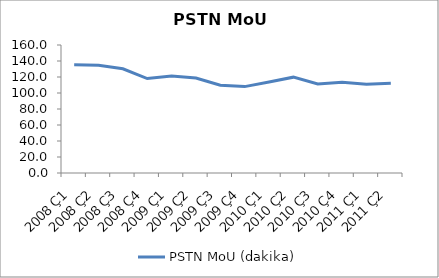
| Category | PSTN MoU (dakika) |
|---|---|
| 2008 Ç1 | 135.4 |
| 2008 Ç2 | 134.8 |
| 2008 Ç3 | 130.3 |
| 2008 Ç4 | 118.1 |
| 2009 Ç1 | 121.2 |
| 2009 Ç2 | 118.7 |
| 2009 Ç3 | 109.7 |
| 2009 Ç4 | 108 |
| 2010 Ç1 | 113.8 |
| 2010 Ç2 | 119.8 |
| 2010 Ç3 | 111.4 |
| 2010 Ç4 | 113.5 |
| 2011 Ç1 | 110.9 |
| 2011 Ç2 | 112.2 |